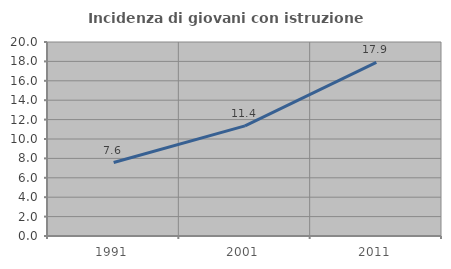
| Category | Incidenza di giovani con istruzione universitaria |
|---|---|
| 1991.0 | 7.576 |
| 2001.0 | 11.353 |
| 2011.0 | 17.892 |